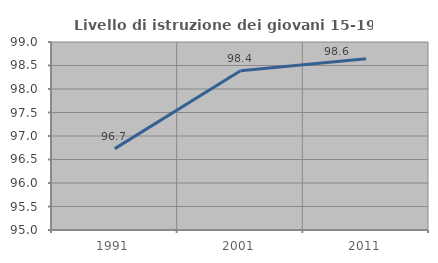
| Category | Livello di istruzione dei giovani 15-19 anni |
|---|---|
| 1991.0 | 96.731 |
| 2001.0 | 98.388 |
| 2011.0 | 98.641 |